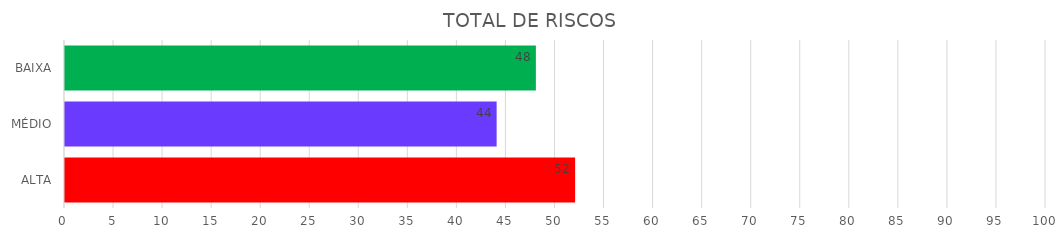
| Category | Series 1 | Series 0 |
|---|---|---|
| ALTA | 52 | 52 |
| MÉDIO | 44 | 44 |
| BAIXA | 48 | 48 |